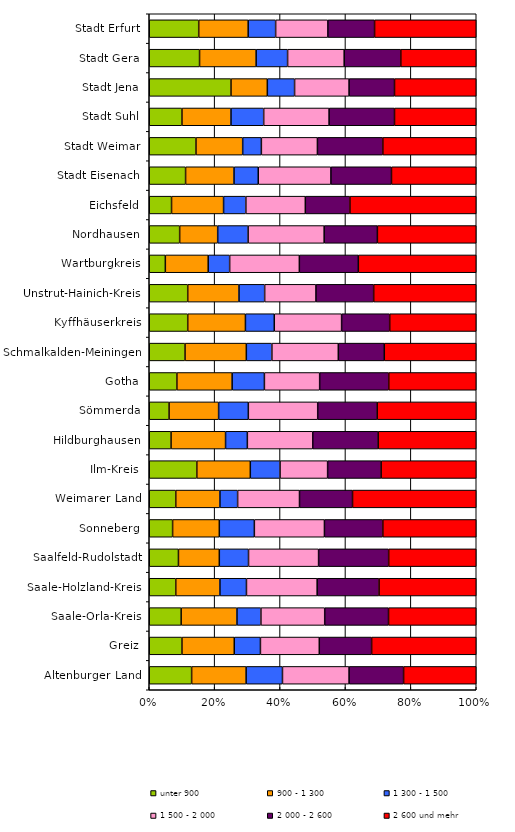
| Category | unter 900  | 900 - 1 300 | 1 300 - 1 500 | 1 500 - 2 000 | 2 000 - 2 600 | 2 600 und mehr |
|---|---|---|---|---|---|---|
| Altenburger Land | 7 | 9 | 6 | 11 | 9 | 12 |
| Greiz | 5 | 8 | 4 | 9 | 8 | 16 |
| Saale-Orla-Kreis | 4 | 7 | 3 | 8 | 8 | 11 |
| Saale-Holzland-Kreis | 3 | 5 | 3 | 8 | 7 | 11 |
| Saalfeld-Rudolstadt | 5 | 7 | 5 | 12 | 12 | 15 |
| Sonneberg | 2 | 4 | 3 | 6 | 5 | 8 |
| Weimarer Land | 3 | 5 | 2 | 7 | 6 | 14 |
| Ilm-Kreis | 8 | 9 | 5 | 8 | 9 | 16 |
| Hildburghausen | 2 | 5 | 2 | 6 | 6 | 9 |
| Sömmerda | 2 | 5 | 3 | 7 | 6 | 10 |
| Gotha | 6 | 12 | 7 | 12 | 15 | 19 |
| Schmalkalden-Meiningen | 7 | 12 | 5 | 13 | 9 | 18 |
| Kyffhäuserkreis | 4 | 6 | 3 | 7 | 5 | 9 |
| Unstrut-Hainich-Kreis | 6 | 8 | 4 | 8 | 9 | 16 |
| Wartburgkreis | 3 | 8 | 4 | 13 | 11 | 22 |
| Nordhausen | 4 | 5 | 4 | 10 | 7 | 13 |
| Eichsfeld | 3 | 7 | 3 | 8 | 6 | 17 |
| Stadt Eisenach | 3 | 4 | 2 | 6 | 5 | 7 |
| Stadt Weimar | 5 | 5 | 2 | 6 | 7 | 10 |
| Stadt Suhl | 2 | 3 | 2 | 4 | 4 | 5 |
| Stadt Jena | 18 | 8 | 6 | 12 | 10 | 18 |
| Stadt Gera | 8 | 9 | 5 | 9 | 9 | 12 |
| Stadt Erfurt | 18 | 18 | 10 | 19 | 17 | 37 |